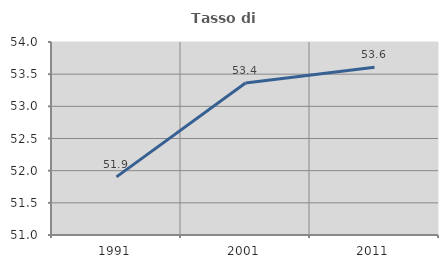
| Category | Tasso di occupazione   |
|---|---|
| 1991.0 | 51.904 |
| 2001.0 | 53.363 |
| 2011.0 | 53.607 |